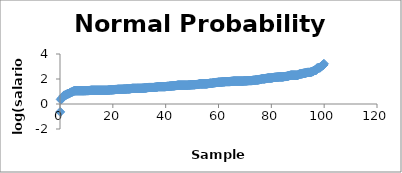
| Category | Series 0 |
|---|---|
| 0.09505703422053231 | -0.635 |
| 0.28517110266159695 | 0.358 |
| 0.47528517110266155 | 0.405 |
| 0.6653992395437263 | 0.405 |
| 0.8555133079847909 | 0.489 |
| 1.0456273764258555 | 0.513 |
| 1.2357414448669202 | 0.56 |
| 1.4258555133079847 | 0.673 |
| 1.6159695817490494 | 0.693 |
| 1.806083650190114 | 0.693 |
| 1.9961977186311786 | 0.693 |
| 2.1863117870722433 | 0.693 |
| 2.376425855513308 | 0.761 |
| 2.5665399239543727 | 0.775 |
| 2.756653992395437 | 0.802 |
| 2.9467680608365017 | 0.811 |
| 3.1368821292775664 | 0.82 |
| 3.326996197718631 | 0.833 |
| 3.517110266159696 | 0.837 |
| 3.70722433460076 | 0.867 |
| 3.8973384030418248 | 0.916 |
| 4.087452471482889 | 0.928 |
| 4.277566539923954 | 0.932 |
| 4.4676806083650185 | 0.956 |
| 4.657794676806083 | 0.975 |
| 4.847908745247148 | 0.993 |
| 5.038022813688213 | 1.012 |
| 5.228136882129276 | 1.04 |
| 5.418250950570341 | 1.054 |
| 5.608365019011406 | 1.058 |
| 5.7984790874524705 | 1.061 |
| 5.988593155893535 | 1.061 |
| 6.1787072243346 | 1.065 |
| 6.368821292775665 | 1.065 |
| 6.558935361216729 | 1.065 |
| 6.749049429657794 | 1.065 |
| 6.939163498098859 | 1.065 |
| 7.1292775665399235 | 1.065 |
| 7.319391634980987 | 1.065 |
| 7.509505703422052 | 1.065 |
| 7.699619771863117 | 1.065 |
| 7.8897338403041815 | 1.065 |
| 8.079847908745247 | 1.065 |
| 8.26996197718631 | 1.065 |
| 8.460076045627376 | 1.065 |
| 8.65019011406844 | 1.065 |
| 8.840304182509506 | 1.065 |
| 9.03041825095057 | 1.065 |
| 9.220532319391635 | 1.068 |
| 9.4106463878327 | 1.068 |
| 9.600760456273765 | 1.068 |
| 9.790874524714829 | 1.068 |
| 9.980988593155894 | 1.072 |
| 10.171102661596958 | 1.072 |
| 10.361216730038022 | 1.072 |
| 10.551330798479087 | 1.072 |
| 10.741444866920151 | 1.072 |
| 10.931558935361217 | 1.075 |
| 11.12167300380228 | 1.082 |
| 11.311787072243346 | 1.082 |
| 11.50190114068441 | 1.082 |
| 11.692015209125476 | 1.099 |
| 11.88212927756654 | 1.099 |
| 12.072243346007605 | 1.099 |
| 12.262357414448669 | 1.099 |
| 12.452471482889733 | 1.099 |
| 12.642585551330798 | 1.099 |
| 12.832699619771862 | 1.099 |
| 13.022813688212928 | 1.099 |
| 13.212927756653992 | 1.099 |
| 13.403041825095057 | 1.099 |
| 13.593155893536121 | 1.099 |
| 13.783269961977187 | 1.099 |
| 13.97338403041825 | 1.099 |
| 14.163498098859316 | 1.099 |
| 14.35361216730038 | 1.099 |
| 14.543726235741444 | 1.099 |
| 14.73384030418251 | 1.099 |
| 14.923954372623573 | 1.099 |
| 15.114068441064639 | 1.099 |
| 15.304182509505702 | 1.099 |
| 15.494296577946768 | 1.099 |
| 15.684410646387832 | 1.099 |
| 15.874524714828897 | 1.099 |
| 16.06463878326996 | 1.099 |
| 16.254752851711025 | 1.099 |
| 16.444866920152087 | 1.099 |
| 16.634980988593153 | 1.099 |
| 16.82509505703422 | 1.099 |
| 17.015209125475284 | 1.099 |
| 17.205323193916346 | 1.099 |
| 17.39543726235741 | 1.099 |
| 17.585551330798477 | 1.099 |
| 17.775665399239543 | 1.099 |
| 17.965779467680605 | 1.099 |
| 18.15589353612167 | 1.115 |
| 18.346007604562736 | 1.115 |
| 18.536121673003798 | 1.115 |
| 18.726235741444864 | 1.118 |
| 18.91634980988593 | 1.125 |
| 19.106463878326995 | 1.131 |
| 19.296577946768057 | 1.131 |
| 19.486692015209123 | 1.131 |
| 19.676806083650188 | 1.131 |
| 19.866920152091254 | 1.141 |
| 20.057034220532316 | 1.141 |
| 20.24714828897338 | 1.141 |
| 20.437262357414447 | 1.147 |
| 20.62737642585551 | 1.147 |
| 20.817490494296575 | 1.157 |
| 21.00760456273764 | 1.163 |
| 21.197718631178706 | 1.163 |
| 21.387832699619768 | 1.163 |
| 21.577946768060833 | 1.163 |
| 21.7680608365019 | 1.176 |
| 21.958174904942965 | 1.176 |
| 22.148288973384027 | 1.179 |
| 22.338403041825092 | 1.179 |
| 22.528517110266158 | 1.179 |
| 22.71863117870722 | 1.179 |
| 22.908745247148286 | 1.179 |
| 23.09885931558935 | 1.179 |
| 23.288973384030417 | 1.179 |
| 23.47908745247148 | 1.179 |
| 23.669201520912544 | 1.182 |
| 23.85931558935361 | 1.182 |
| 24.049429657794676 | 1.188 |
| 24.239543726235738 | 1.191 |
| 24.429657794676803 | 1.194 |
| 24.61977186311787 | 1.194 |
| 24.80988593155893 | 1.194 |
| 24.999999999999996 | 1.203 |
| 25.190114068441062 | 1.203 |
| 25.380228136882128 | 1.209 |
| 25.57034220532319 | 1.209 |
| 25.760456273764255 | 1.209 |
| 25.95057034220532 | 1.209 |
| 26.140684410646386 | 1.209 |
| 26.33079847908745 | 1.215 |
| 26.520912547528514 | 1.224 |
| 26.71102661596958 | 1.224 |
| 26.90114068441064 | 1.238 |
| 27.091254752851707 | 1.238 |
| 27.281368821292773 | 1.253 |
| 27.47148288973384 | 1.253 |
| 27.6615969581749 | 1.253 |
| 27.851711026615966 | 1.253 |
| 28.041825095057032 | 1.253 |
| 28.231939163498097 | 1.253 |
| 28.42205323193916 | 1.253 |
| 28.612167300380225 | 1.253 |
| 28.80228136882129 | 1.253 |
| 28.992395437262353 | 1.253 |
| 29.18250950570342 | 1.253 |
| 29.372623574144484 | 1.253 |
| 29.56273764258555 | 1.253 |
| 29.75285171102661 | 1.253 |
| 29.942965779467677 | 1.253 |
| 30.133079847908743 | 1.253 |
| 30.32319391634981 | 1.253 |
| 30.51330798479087 | 1.253 |
| 30.703422053231936 | 1.256 |
| 30.893536121673 | 1.256 |
| 31.083650190114064 | 1.258 |
| 31.27376425855513 | 1.264 |
| 31.463878326996195 | 1.267 |
| 31.65399239543726 | 1.267 |
| 31.844106463878322 | 1.275 |
| 32.03422053231939 | 1.281 |
| 32.22433460076045 | 1.281 |
| 32.41444866920152 | 1.281 |
| 32.60456273764258 | 1.292 |
| 32.79467680608364 | 1.295 |
| 32.98479087452471 | 1.311 |
| 33.174904942965775 | 1.311 |
| 33.365019011406844 | 1.316 |
| 33.555133079847906 | 1.322 |
| 33.74524714828897 | 1.322 |
| 33.93536121673004 | 1.322 |
| 34.1254752851711 | 1.322 |
| 34.31558935361216 | 1.322 |
| 34.50570342205323 | 1.322 |
| 34.69581749049429 | 1.322 |
| 34.885931558935354 | 1.322 |
| 35.07604562737642 | 1.322 |
| 35.266159695817485 | 1.322 |
| 35.456273764258555 | 1.322 |
| 35.64638783269962 | 1.324 |
| 35.83650190114068 | 1.335 |
| 36.02661596958175 | 1.338 |
| 36.21673003802281 | 1.343 |
| 36.40684410646387 | 1.348 |
| 36.59695817490494 | 1.356 |
| 36.787072243346 | 1.364 |
| 36.977186311787065 | 1.374 |
| 37.167300380228134 | 1.386 |
| 37.357414448669196 | 1.386 |
| 37.547528517110266 | 1.386 |
| 37.73764258555133 | 1.386 |
| 37.92775665399239 | 1.386 |
| 38.11787072243346 | 1.386 |
| 38.30798479087452 | 1.386 |
| 38.49809885931558 | 1.386 |
| 38.68821292775665 | 1.386 |
| 38.878326996197714 | 1.386 |
| 39.068441064638776 | 1.386 |
| 39.258555133079845 | 1.386 |
| 39.44866920152091 | 1.386 |
| 39.638783269961976 | 1.386 |
| 39.82889733840304 | 1.386 |
| 40.0190114068441 | 1.399 |
| 40.20912547528517 | 1.399 |
| 40.39923954372623 | 1.406 |
| 40.589353612167294 | 1.411 |
| 40.77946768060836 | 1.411 |
| 40.969581749049425 | 1.411 |
| 41.15969581749049 | 1.413 |
| 41.349809885931556 | 1.421 |
| 41.53992395437262 | 1.428 |
| 41.73003802281369 | 1.435 |
| 41.92015209125475 | 1.435 |
| 42.11026615969581 | 1.435 |
| 42.30038022813688 | 1.445 |
| 42.49049429657794 | 1.447 |
| 42.680608365019005 | 1.452 |
| 42.870722433460074 | 1.454 |
| 43.060836501901136 | 1.456 |
| 43.2509505703422 | 1.456 |
| 43.44106463878327 | 1.466 |
| 43.63117870722433 | 1.468 |
| 43.8212927756654 | 1.477 |
| 44.01140684410646 | 1.477 |
| 44.20152091254752 | 1.491 |
| 44.39163498098859 | 1.491 |
| 44.581749049429654 | 1.504 |
| 44.771863117870716 | 1.504 |
| 44.961977186311785 | 1.504 |
| 45.15209125475285 | 1.504 |
| 45.34220532319391 | 1.504 |
| 45.53231939163498 | 1.504 |
| 45.72243346007604 | 1.504 |
| 45.91254752851711 | 1.504 |
| 46.10266159695817 | 1.504 |
| 46.29277566539923 | 1.504 |
| 46.4828897338403 | 1.504 |
| 46.673003802281364 | 1.504 |
| 46.86311787072243 | 1.504 |
| 47.053231939163496 | 1.504 |
| 47.24334600760456 | 1.504 |
| 47.43346007604562 | 1.504 |
| 47.62357414448669 | 1.504 |
| 47.81368821292775 | 1.504 |
| 48.00380228136882 | 1.504 |
| 48.19391634980988 | 1.504 |
| 48.384030418250944 | 1.506 |
| 48.57414448669201 | 1.515 |
| 48.764258555133075 | 1.515 |
| 48.95437262357414 | 1.52 |
| 49.14448669201521 | 1.52 |
| 49.33460076045627 | 1.526 |
| 49.52471482889733 | 1.533 |
| 49.7148288973384 | 1.533 |
| 49.90494296577946 | 1.537 |
| 50.09505703422053 | 1.537 |
| 50.28517110266159 | 1.541 |
| 50.475285171102655 | 1.543 |
| 50.665399239543724 | 1.543 |
| 50.855513307984786 | 1.543 |
| 51.04562737642585 | 1.545 |
| 51.23574144486692 | 1.552 |
| 51.42585551330798 | 1.558 |
| 51.61596958174904 | 1.558 |
| 51.80608365019011 | 1.558 |
| 51.99619771863117 | 1.567 |
| 52.18631178707224 | 1.567 |
| 52.376425855513304 | 1.571 |
| 52.566539923954366 | 1.591 |
| 52.756653992395435 | 1.599 |
| 52.9467680608365 | 1.609 |
| 53.13688212927756 | 1.609 |
| 53.32699619771863 | 1.609 |
| 53.51711026615969 | 1.609 |
| 53.70722433460075 | 1.609 |
| 53.89733840304182 | 1.609 |
| 54.087452471482884 | 1.609 |
| 54.27756653992395 | 1.609 |
| 54.467680608365015 | 1.609 |
| 54.65779467680608 | 1.609 |
| 54.847908745247146 | 1.609 |
| 55.03802281368821 | 1.609 |
| 55.22813688212927 | 1.609 |
| 55.41825095057034 | 1.609 |
| 55.6083650190114 | 1.619 |
| 55.79847908745246 | 1.619 |
| 55.98859315589353 | 1.631 |
| 56.178707224334595 | 1.635 |
| 56.368821292775664 | 1.639 |
| 56.558935361216726 | 1.649 |
| 56.74904942965779 | 1.658 |
| 56.93916349809886 | 1.658 |
| 57.12927756653992 | 1.658 |
| 57.31939163498098 | 1.658 |
| 57.50950570342205 | 1.658 |
| 57.69961977186311 | 1.668 |
| 57.889733840304174 | 1.686 |
| 58.07984790874524 | 1.692 |
| 58.269961977186306 | 1.701 |
| 58.460076045627375 | 1.705 |
| 58.65019011406844 | 1.705 |
| 58.8403041825095 | 1.708 |
| 59.03041825095057 | 1.719 |
| 59.22053231939163 | 1.723 |
| 59.41064638783269 | 1.723 |
| 59.60076045627376 | 1.728 |
| 59.79087452471482 | 1.732 |
| 59.980988593155885 | 1.74 |
| 60.171102661596954 | 1.742 |
| 60.36121673003802 | 1.742 |
| 60.551330798479086 | 1.742 |
| 60.74144486692015 | 1.749 |
| 60.93155893536121 | 1.753 |
| 61.12167300380228 | 1.754 |
| 61.31178707224334 | 1.758 |
| 61.5019011406844 | 1.763 |
| 61.69201520912547 | 1.765 |
| 61.882129277566534 | 1.775 |
| 62.072243346007596 | 1.775 |
| 62.262357414448665 | 1.777 |
| 62.45247148288973 | 1.783 |
| 62.6425855513308 | 1.792 |
| 62.83269961977186 | 1.792 |
| 63.02281368821292 | 1.792 |
| 63.21292775665399 | 1.792 |
| 63.40304182509505 | 1.792 |
| 63.593155893536114 | 1.792 |
| 63.78326996197718 | 1.792 |
| 63.973384030418245 | 1.792 |
| 64.16349809885931 | 1.792 |
| 64.35361216730037 | 1.792 |
| 64.54372623574145 | 1.805 |
| 64.73384030418251 | 1.805 |
| 64.92395437262357 | 1.81 |
| 65.11406844106463 | 1.816 |
| 65.3041825095057 | 1.816 |
| 65.49429657794676 | 1.821 |
| 65.68441064638783 | 1.828 |
| 65.8745247148289 | 1.833 |
| 66.06463878326996 | 1.833 |
| 66.25475285171102 | 1.833 |
| 66.44486692015208 | 1.833 |
| 66.63498098859316 | 1.833 |
| 66.82509505703422 | 1.833 |
| 67.01520912547528 | 1.833 |
| 67.20532319391634 | 1.833 |
| 67.3954372623574 | 1.833 |
| 67.58555133079847 | 1.833 |
| 67.77566539923954 | 1.833 |
| 67.9657794676806 | 1.833 |
| 68.15589353612167 | 1.833 |
| 68.34600760456273 | 1.833 |
| 68.53612167300379 | 1.833 |
| 68.72623574144487 | 1.833 |
| 68.91634980988593 | 1.833 |
| 69.10646387832699 | 1.833 |
| 69.29657794676805 | 1.834 |
| 69.48669201520912 | 1.839 |
| 69.67680608365018 | 1.845 |
| 69.86692015209125 | 1.845 |
| 70.05703422053232 | 1.848 |
| 70.24714828897338 | 1.85 |
| 70.43726235741444 | 1.85 |
| 70.6273764258555 | 1.853 |
| 70.81749049429658 | 1.861 |
| 71.00760456273764 | 1.864 |
| 71.1977186311787 | 1.866 |
| 71.38783269961976 | 1.872 |
| 71.57794676806083 | 1.872 |
| 71.76806083650189 | 1.872 |
| 71.95817490494296 | 1.872 |
| 72.14828897338403 | 1.872 |
| 72.33840304182509 | 1.872 |
| 72.52851711026615 | 1.872 |
| 72.71863117870721 | 1.876 |
| 72.90874524714829 | 1.892 |
| 73.09885931558935 | 1.892 |
| 73.28897338403041 | 1.892 |
| 73.47908745247148 | 1.898 |
| 73.66920152091254 | 1.898 |
| 73.8593155893536 | 1.911 |
| 74.04942965779468 | 1.917 |
| 74.23954372623574 | 1.924 |
| 74.4296577946768 | 1.929 |
| 74.61977186311786 | 1.929 |
| 74.80988593155892 | 1.929 |
| 75.0 | 1.929 |
| 75.19011406844106 | 1.946 |
| 75.38022813688212 | 1.946 |
| 75.57034220532319 | 1.966 |
| 75.76045627376425 | 1.966 |
| 75.95057034220531 | 1.981 |
| 76.14068441064639 | 1.982 |
| 76.33079847908745 | 1.996 |
| 76.52091254752851 | 2.015 |
| 76.71102661596957 | 2.015 |
| 76.90114068441063 | 2.015 |
| 77.09125475285171 | 2.015 |
| 77.28136882129277 | 2.015 |
| 77.47148288973384 | 2.015 |
| 77.6615969581749 | 2.028 |
| 77.85171102661596 | 2.032 |
| 78.04182509505702 | 2.052 |
| 78.2319391634981 | 2.052 |
| 78.42205323193916 | 2.055 |
| 78.61216730038022 | 2.067 |
| 78.80228136882128 | 2.079 |
| 78.99239543726235 | 2.079 |
| 79.18250950570342 | 2.079 |
| 79.37262357414448 | 2.079 |
| 79.56273764258555 | 2.079 |
| 79.75285171102661 | 2.079 |
| 79.94296577946767 | 2.082 |
| 80.13307984790873 | 2.092 |
| 80.32319391634981 | 2.096 |
| 80.51330798479087 | 2.102 |
| 80.70342205323193 | 2.12 |
| 80.893536121673 | 2.12 |
| 81.08365019011406 | 2.132 |
| 81.27376425855513 | 2.132 |
| 81.4638783269962 | 2.134 |
| 81.65399239543726 | 2.138 |
| 81.84410646387832 | 2.14 |
| 82.03422053231938 | 2.144 |
| 82.22433460076044 | 2.152 |
| 82.41444866920152 | 2.155 |
| 82.60456273764258 | 2.156 |
| 82.79467680608364 | 2.158 |
| 82.9847908745247 | 2.169 |
| 83.17490494296577 | 2.169 |
| 83.36501901140684 | 2.169 |
| 83.5551330798479 | 2.169 |
| 83.74524714828897 | 2.169 |
| 83.93536121673003 | 2.169 |
| 84.12547528517109 | 2.169 |
| 84.31558935361215 | 2.171 |
| 84.50570342205323 | 2.175 |
| 84.69581749049429 | 2.188 |
| 84.88593155893535 | 2.197 |
| 85.07604562737642 | 2.197 |
| 85.26615969581748 | 2.197 |
| 85.45627376425855 | 2.203 |
| 85.64638783269962 | 2.207 |
| 85.83650190114068 | 2.212 |
| 86.02661596958174 | 2.23 |
| 86.2167300380228 | 2.233 |
| 86.40684410646386 | 2.243 |
| 86.59695817490494 | 2.258 |
| 86.787072243346 | 2.27 |
| 86.97718631178707 | 2.282 |
| 87.16730038022813 | 2.287 |
| 87.35741444866919 | 2.303 |
| 87.54752851711027 | 2.303 |
| 87.73764258555133 | 2.303 |
| 87.92775665399239 | 2.303 |
| 88.11787072243345 | 2.303 |
| 88.30798479087451 | 2.303 |
| 88.49809885931558 | 2.303 |
| 88.68821292775665 | 2.303 |
| 88.87832699619771 | 2.303 |
| 89.06844106463878 | 2.303 |
| 89.25855513307984 | 2.303 |
| 89.4486692015209 | 2.303 |
| 89.63878326996198 | 2.303 |
| 89.82889733840304 | 2.303 |
| 90.0190114068441 | 2.303 |
| 90.20912547528516 | 2.34 |
| 90.39923954372622 | 2.364 |
| 90.58935361216729 | 2.39 |
| 90.77946768060836 | 2.391 |
| 90.96958174904942 | 2.393 |
| 91.15969581749049 | 2.407 |
| 91.34980988593155 | 2.408 |
| 91.53992395437261 | 2.42 |
| 91.73003802281369 | 2.42 |
| 91.92015209125475 | 2.447 |
| 92.11026615969581 | 2.448 |
| 92.30038022813687 | 2.46 |
| 92.49049429657794 | 2.465 |
| 92.680608365019 | 2.47 |
| 92.87072243346007 | 2.477 |
| 93.06083650190114 | 2.483 |
| 93.2509505703422 | 2.503 |
| 93.44106463878326 | 2.517 |
| 93.63117870722432 | 2.526 |
| 93.8212927756654 | 2.526 |
| 94.01140684410646 | 2.526 |
| 94.20152091254752 | 2.526 |
| 94.39163498098858 | 2.526 |
| 94.58174904942965 | 2.526 |
| 94.77186311787071 | 2.526 |
| 94.96197718631178 | 2.565 |
| 95.15209125475285 | 2.571 |
| 95.34220532319391 | 2.577 |
| 95.53231939163497 | 2.59 |
| 95.72243346007603 | 2.617 |
| 95.91254752851711 | 2.635 |
| 96.10266159695817 | 2.666 |
| 96.29277566539923 | 2.68 |
| 96.4828897338403 | 2.708 |
| 96.67300380228136 | 2.708 |
| 96.86311787072242 | 2.708 |
| 97.0532319391635 | 2.733 |
| 97.24334600760456 | 2.852 |
| 97.43346007604562 | 2.862 |
| 97.62357414448668 | 2.874 |
| 97.81368821292774 | 2.89 |
| 98.00380228136882 | 2.899 |
| 98.19391634980988 | 2.899 |
| 98.38403041825094 | 2.9 |
| 98.574144486692 | 2.939 |
| 98.76425855513307 | 2.995 |
| 98.95437262357413 | 2.996 |
| 99.1444866920152 | 3.074 |
| 99.33460076045627 | 3.085 |
| 99.52471482889733 | 3.1 |
| 99.71482889733839 | 3.129 |
| 99.90494296577945 | 3.218 |